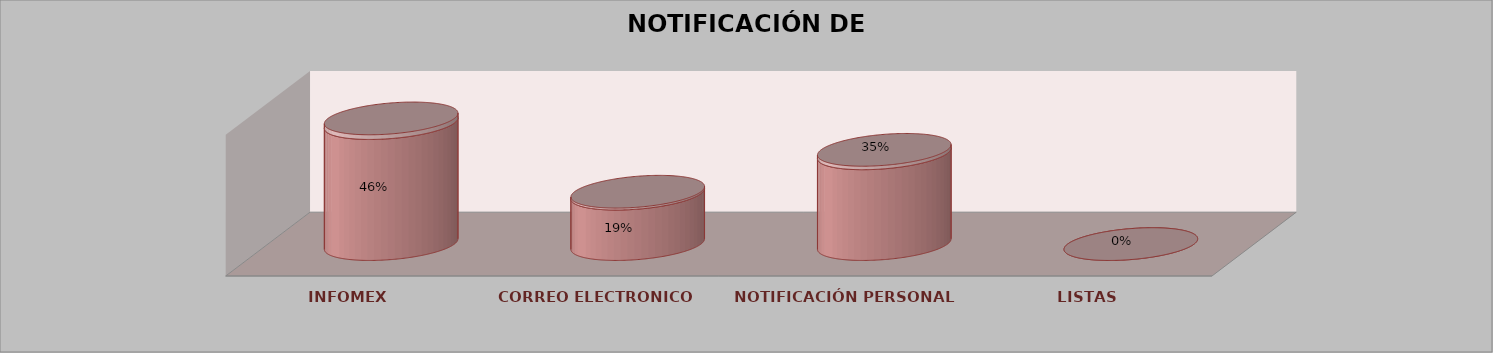
| Category | Series 0 | Series 1 | Series 2 | Series 3 | Series 4 |
|---|---|---|---|---|---|
| INFOMEX |  |  |  | 12 | 0.462 |
| CORREO ELECTRONICO |  |  |  | 5 | 0.192 |
| NOTIFICACIÓN PERSONAL |  |  |  | 9 | 0.346 |
| LISTAS |  |  |  | 0 | 0 |